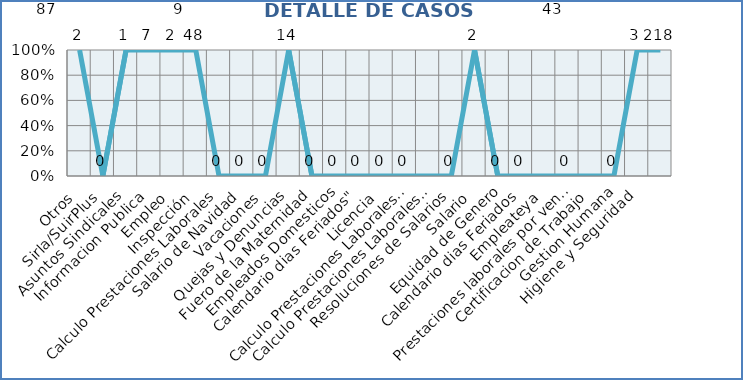
| Category | Series 0 |
|---|---|
| Otros | 2 |
| Sirla/SuirPlus | 0 |
| Asuntos Sindicales | 1 |
| Informacion Publica | 7 |
| Empleo | 2 |
| Inspección | 48 |
| Calculo Prestaciones Laborales | 0 |
| Salario de Navidad | 0 |
| Vacaciones | 0 |
| Quejas y Denuncias | 14 |
| Fuero de la Maternidad | 0 |
| Empleados Domesticos | 0 |
| Calendario dias Feriados" | 0 |
| Licencia | 0 |
| Calculo Prestaciones Laborales por quiebra empresa | 0 |
| Calculo Prestaciones Laborales por renuncia | 0 |
| Resoluciones de Salarios | 0 |
| Salario | 2 |
| Equidad de Genero | 0 |
| Calendario dias Feriados | 0 |
| Empleateya | 0 |
| Prestaciones laborales por venta empresa | 0 |
| Certificacion de Trabajo | 0 |
| Gestion Humana | 0 |
| Higiene y Seguridad | 3 |